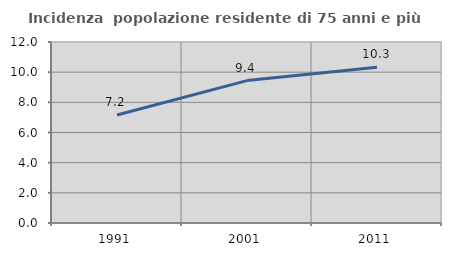
| Category | Incidenza  popolazione residente di 75 anni e più |
|---|---|
| 1991.0 | 7.159 |
| 2001.0 | 9.442 |
| 2011.0 | 10.329 |